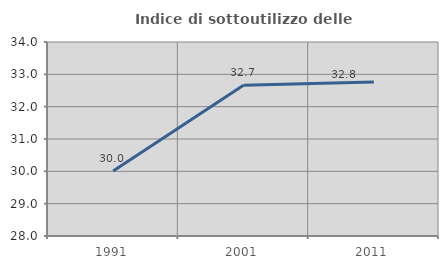
| Category | Indice di sottoutilizzo delle abitazioni  |
|---|---|
| 1991.0 | 30.011 |
| 2001.0 | 32.659 |
| 2011.0 | 32.766 |